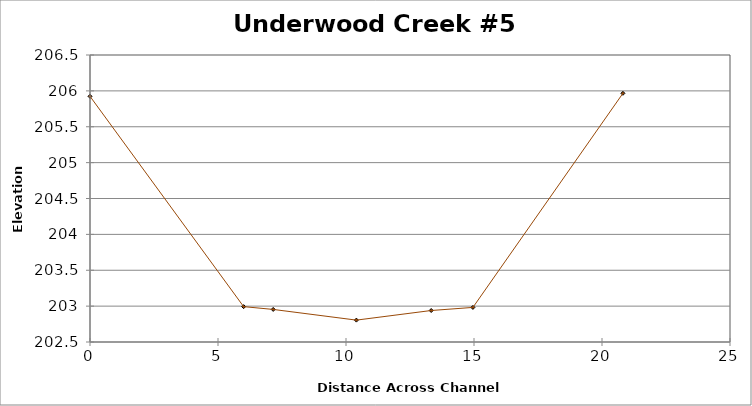
| Category | Series 0 |
|---|---|
| 0.0 | 205.924 |
| 6.001453907737302 | 202.993 |
| 7.156306659411124 | 202.954 |
| 10.405650484172021 | 202.805 |
| 13.32825033592527 | 202.939 |
| 14.957280401250072 | 202.982 |
| 20.817539720568075 | 205.966 |